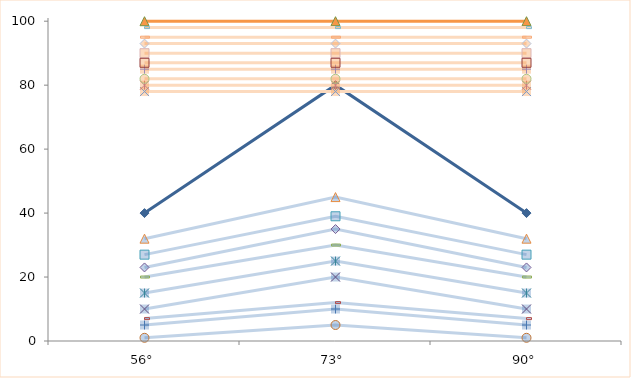
| Category | 1500 | 4500 |
|---|---|---|
| 56° | 87 | 100 |
| 73° | 87 | 100 |
| 90° | 87 | 100 |